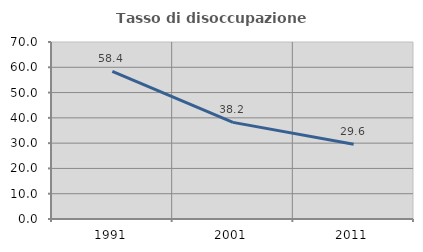
| Category | Tasso di disoccupazione giovanile  |
|---|---|
| 1991.0 | 58.353 |
| 2001.0 | 38.208 |
| 2011.0 | 29.586 |